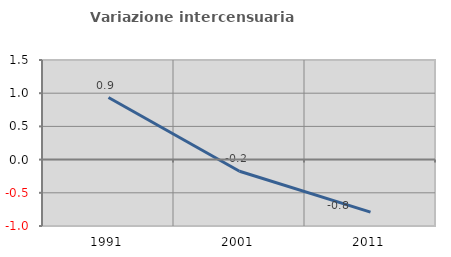
| Category | Variazione intercensuaria annua |
|---|---|
| 1991.0 | 0.934 |
| 2001.0 | -0.175 |
| 2011.0 | -0.791 |